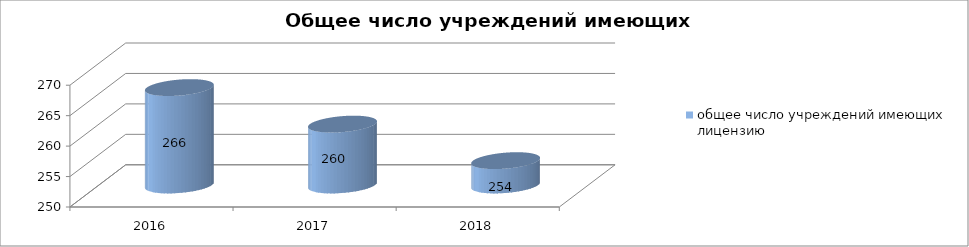
| Category | общее число учреждений имеющих лицензию |
|---|---|
| 2016.0 | 266 |
| 2017.0 | 260 |
| 2018.0 | 254 |